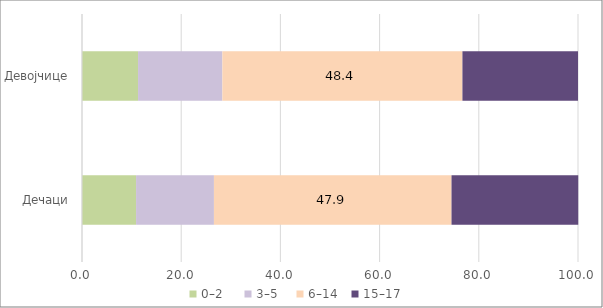
| Category | 0–2   | 3–5  | 6–14 | 15–17 |
|---|---|---|---|---|
| Дечаци | 10.9 | 15.7 | 47.9 | 25.55 |
| Девојчице | 11.3 | 17 | 48.4 | 23.3 |